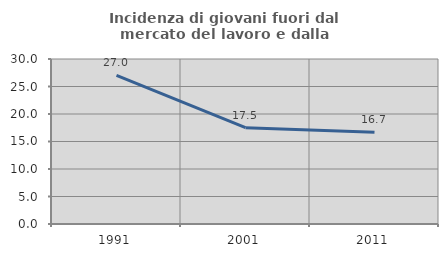
| Category | Incidenza di giovani fuori dal mercato del lavoro e dalla formazione  |
|---|---|
| 1991.0 | 27.014 |
| 2001.0 | 17.51 |
| 2011.0 | 16.667 |